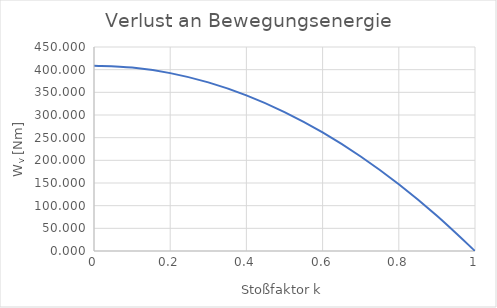
| Category | Series 0 |
|---|---|
| 0.0 | 408.716 |
| 0.1 | 404.628 |
| 0.2 | 392.367 |
| 0.3 | 371.931 |
| 0.4 | 343.321 |
| 0.5 | 306.537 |
| 0.6 | 261.578 |
| 0.7 | 208.445 |
| 0.8 | 147.138 |
| 0.9 | 77.656 |
| 1.0 | 0 |